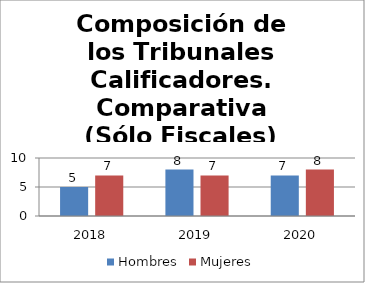
| Category | Hombres | Mujeres |
|---|---|---|
| 2018.0 | 5 | 7 |
| 2019.0 | 8 | 7 |
| 2020.0 | 7 | 8 |